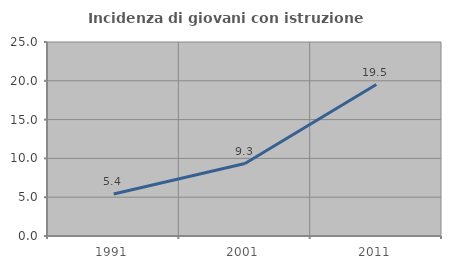
| Category | Incidenza di giovani con istruzione universitaria |
|---|---|
| 1991.0 | 5.405 |
| 2001.0 | 9.333 |
| 2011.0 | 19.512 |